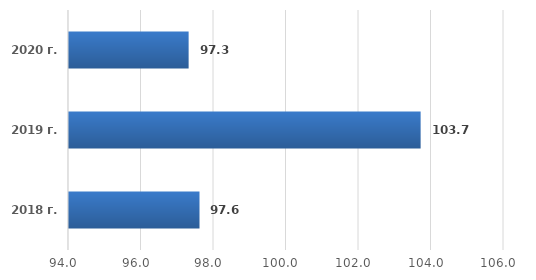
| Category | Series 0 |
|---|---|
| 2018 г. | 97.6 |
| 2019 г. | 103.7 |
| 2020 г. | 97.3 |